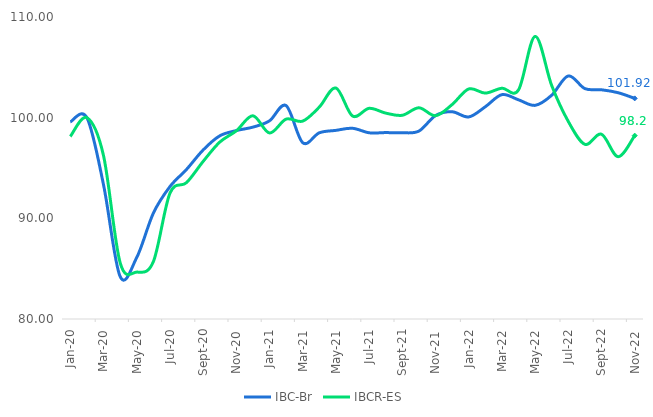
| Category | IBC-Br | IBCR-ES |
|---|---|---|
| 2020-01-01 | 99.58 | 98.132 |
| 2020-02-01 | 100 | 100 |
| 2020-03-01 | 93.346 | 96.236 |
| 2020-04-01 | 84.227 | 85.606 |
| 2020-05-01 | 86.101 | 84.658 |
| 2020-06-01 | 90.504 | 85.682 |
| 2020-07-01 | 93.147 | 92.479 |
| 2020-08-01 | 94.856 | 93.545 |
| 2020-09-01 | 96.787 | 95.65 |
| 2020-10-01 | 98.19 | 97.567 |
| 2020-11-01 | 98.718 | 98.69 |
| 2020-12-01 | 99.06 | 100.188 |
| 2021-01-01 | 99.687 | 98.48 |
| 2021-02-01 | 101.197 | 99.854 |
| 2021-03-01 | 97.514 | 99.658 |
| 2021-04-01 | 98.497 | 101.053 |
| 2021-05-01 | 98.739 | 102.949 |
| 2021-06-01 | 98.946 | 100.167 |
| 2021-07-01 | 98.497 | 100.927 |
| 2021-08-01 | 98.518 | 100.453 |
| 2021-09-01 | 98.497 | 100.237 |
| 2021-10-01 | 98.668 | 100.983 |
| 2021-11-01 | 100.207 | 100.195 |
| 2021-12-01 | 100.591 | 101.303 |
| 2022-01-01 | 100.071 | 102.851 |
| 2022-02-01 | 101.083 | 102.44 |
| 2022-03-01 | 102.287 | 102.928 |
| 2022-04-01 | 101.774 | 102.753 |
| 2022-05-01 | 101.225 | 108.072 |
| 2022-06-01 | 102.23 | 103.193 |
| 2022-07-01 | 104.146 | 99.624 |
| 2022-08-01 | 102.885 | 97.351 |
| 2022-09-01 | 102.771 | 98.355 |
| 2022-10-01 | 102.479 | 96.124 |
| 2022-11-01 | 101.916 | 98.216 |